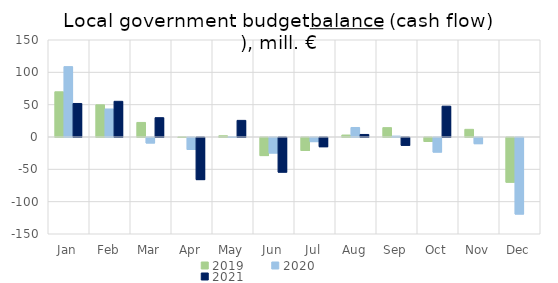
| Category | 2019 | 2020 | 2021 |
|---|---|---|---|
| Jan | 69899.918 | 108823.125 | 51841.777 |
| Feb | 49749.515 | 43336.074 | 55170.117 |
| Mar | 22502.15 | -8510.199 | 29854.421 |
| Apr | 66.197 | -18528 | -65110.731 |
| May | 1895.339 | 267.19 | 25695.562 |
| Jun | -27941.119 | -24020.19 | -53546.319 |
| Jul | -20095.436 | -6388.533 | -14251.375 |
| Aug | 3008.508 | 14711.699 | 3925.548 |
| Sep | 14466.928 | 1399.66 | -12077.429 |
| Oct | -6100.439 | -22549.866 | 47662.114 |
| Nov | 11851.236 | -9553.519 | 0 |
| Dec | -69132.156 | -118383.812 | 0 |